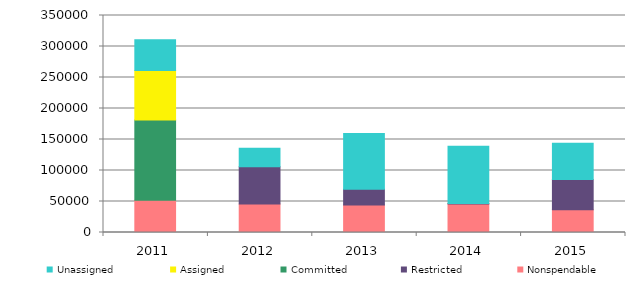
| Category |  Nonspendable  |  Restricted  |  Committed  |  Assigned  |  Unassigned  |
|---|---|---|---|---|---|
| 2011.0 | 51853 | 0 | 129580 | 79816 | 49764 |
| 2012.0 | 46151 | 59768 | 0 | 0 | 30056 |
| 2013.0 | 44190 | 25581 | 0 | 0 | 89954 |
| 2014.0 | 46086 | 677 | 0 | 0 | 92219 |
| 2015.0 | 36588 | 48698 | 0 | 0 | 58824 |